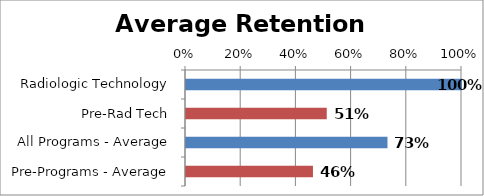
| Category | Series 0 |
|---|---|
| Radiologic Technology | 1 |
| Pre-Rad Tech | 0.51 |
| All Programs - Average | 0.73 |
| Pre-Programs - Average | 0.46 |